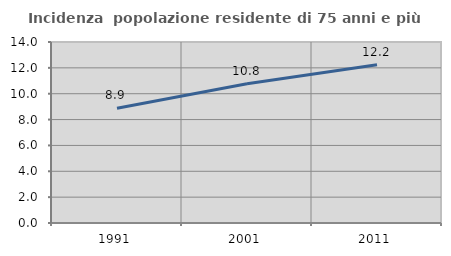
| Category | Incidenza  popolazione residente di 75 anni e più |
|---|---|
| 1991.0 | 8.882 |
| 2001.0 | 10.768 |
| 2011.0 | 12.232 |